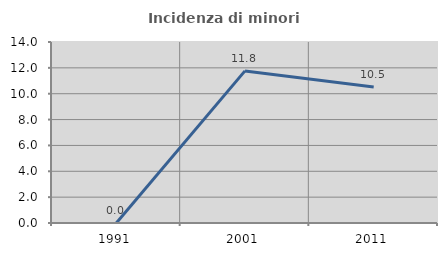
| Category | Incidenza di minori stranieri |
|---|---|
| 1991.0 | 0 |
| 2001.0 | 11.765 |
| 2011.0 | 10.526 |